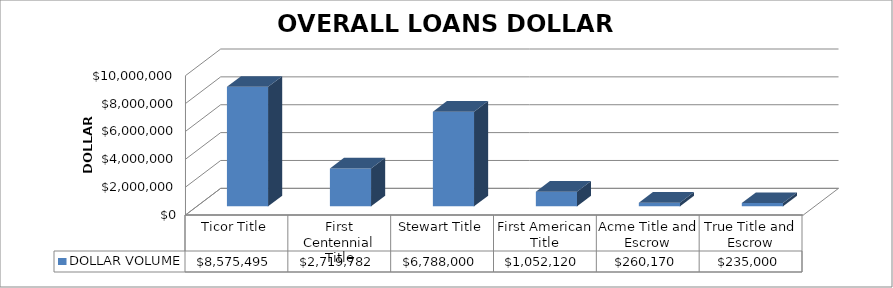
| Category | DOLLAR VOLUME |
|---|---|
| Ticor Title | 8575495 |
| First Centennial Title | 2719782 |
| Stewart Title | 6788000 |
| First American Title | 1052119.73 |
| Acme Title and Escrow | 260170 |
| True Title and Escrow | 235000 |